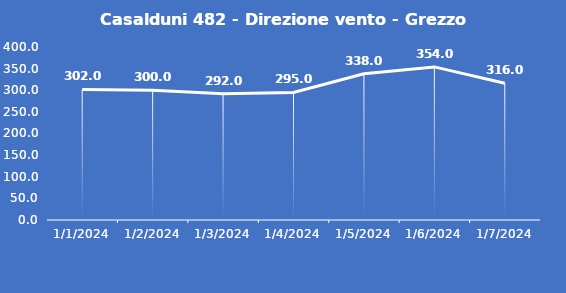
| Category | Casalduni 482 - Direzione vento - Grezzo (°N) |
|---|---|
| 1/1/24 | 302 |
| 1/2/24 | 300 |
| 1/3/24 | 292 |
| 1/4/24 | 295 |
| 1/5/24 | 338 |
| 1/6/24 | 354 |
| 1/7/24 | 316 |